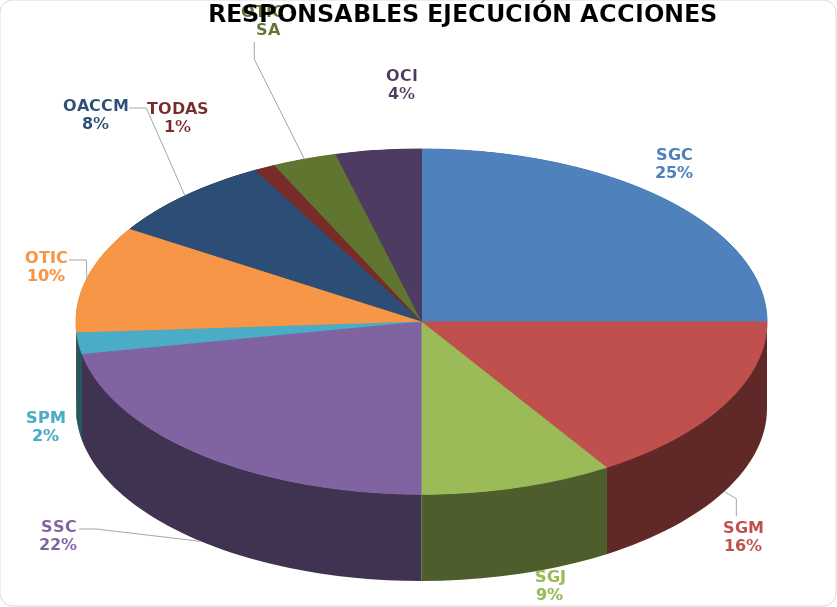
| Category | Series 0 |
|---|---|
| SGC | 25 |
| SGM | 16 |
| SGJ | 9 |
| SSC | 22 |
| SPM | 2 |
| OTIC | 10 |
| OACCM | 8 |
| TODAS | 1 |
| OTIC - SA | 3 |
| OCI | 4 |